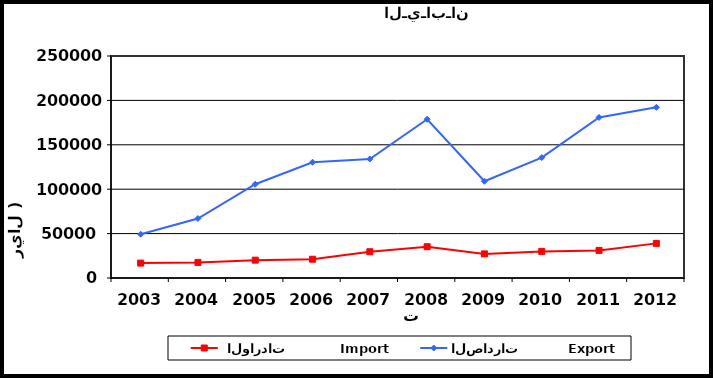
| Category |  الواردات           Import | الصادرات          Export |
|---|---|---|
| 2003.0 | 16797 | 49325 |
| 2004.0 | 17555 | 67006 |
| 2005.0 | 20093 | 105580 |
| 2006.0 | 21146 | 130369 |
| 2007.0 | 29563 | 134007 |
| 2008.0 | 35251 | 178823 |
| 2009.0 | 27142 | 108956 |
| 2010.0 | 29957 | 135634 |
| 2011.0 | 31065 | 180828 |
| 2012.0 | 38989 | 192201 |